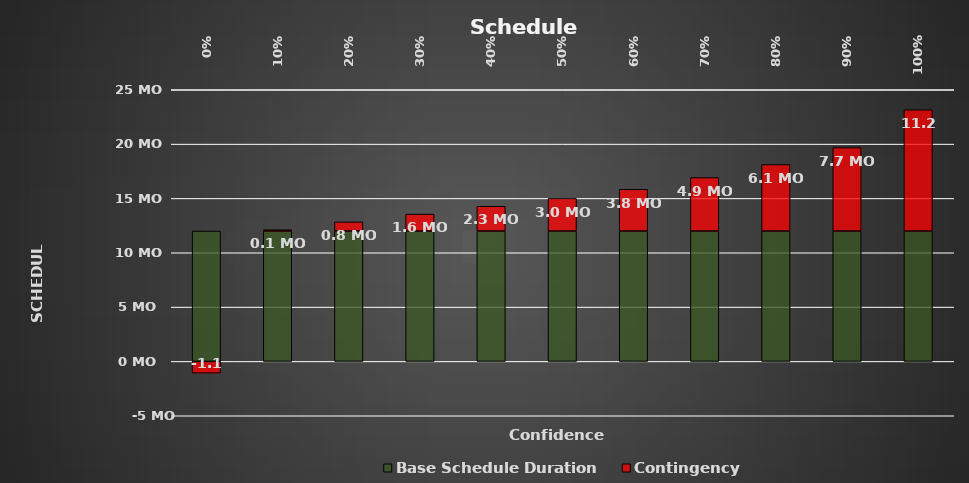
| Category | Base Schedule Duration | Contingency |
|---|---|---|
| 0.0 | 12 | -1.08 |
| 0.1 | 12 | 0.12 |
| 0.2 | 12 | 0.84 |
| 0.3 | 12 | 1.56 |
| 0.4 | 12 | 2.28 |
| 0.5 | 12 | 3 |
| 0.6 | 12 | 3.84 |
| 0.7 | 12 | 4.92 |
| 0.8 | 12 | 6.12 |
| 0.9 | 12 | 7.68 |
| 1.0 | 12 | 11.16 |